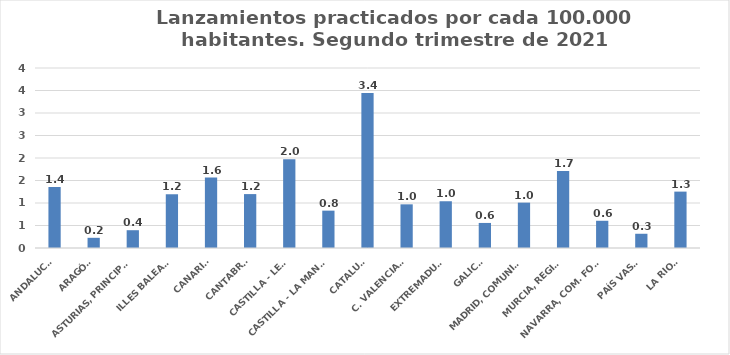
| Category | Series 0 |
|---|---|
| ANDALUCÍA | 1.355 |
| ARAGÓN | 0.226 |
| ASTURIAS, PRINCIPADO | 0.395 |
| ILLES BALEARS | 1.194 |
| CANARIAS | 1.566 |
| CANTABRIA | 1.198 |
| CASTILLA - LEÓN | 1.974 |
| CASTILLA - LA MANCHA | 0.83 |
| CATALUÑA | 3.442 |
| C. VALENCIANA | 0.97 |
| EXTREMADURA | 1.039 |
| GALICIA | 0.557 |
| MADRID, COMUNIDAD | 1.008 |
| MURCIA, REGIÓN | 1.713 |
| NAVARRA, COM. FORAL | 0.605 |
| PAÍS VASCO | 0.316 |
| LA RIOJA | 1.253 |